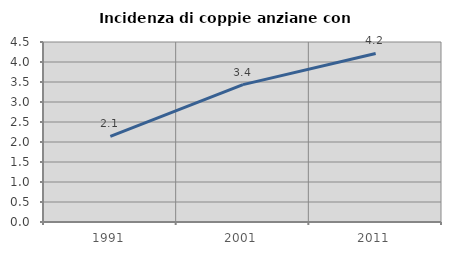
| Category | Incidenza di coppie anziane con figli |
|---|---|
| 1991.0 | 2.143 |
| 2001.0 | 3.435 |
| 2011.0 | 4.214 |